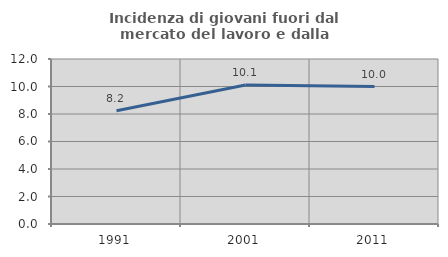
| Category | Incidenza di giovani fuori dal mercato del lavoro e dalla formazione  |
|---|---|
| 1991.0 | 8.234 |
| 2001.0 | 10.106 |
| 2011.0 | 10 |